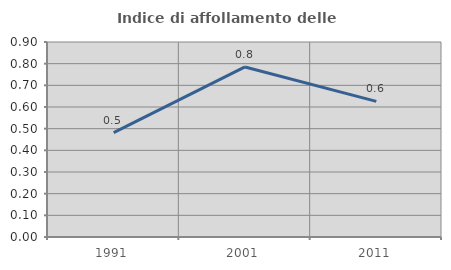
| Category | Indice di affollamento delle abitazioni  |
|---|---|
| 1991.0 | 0.482 |
| 2001.0 | 0.785 |
| 2011.0 | 0.626 |